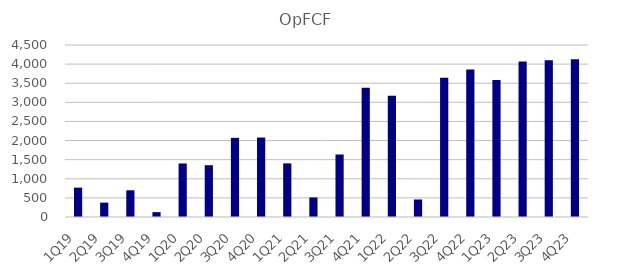
| Category | OpFCF |
|---|---|
| 1Q19 | 768 |
| 2Q19 | 376 |
| 3Q19 | 699 |
| 4Q19 | 127 |
| 1Q20 | 1400 |
| 2Q20 | 1355 |
| 3Q20 | 2071 |
| 4Q20 | 2079 |
| 1Q21 | 1403 |
| 2Q21 | 512 |
| 3Q21 | 1635 |
| 4Q21 | 3381 |
| 1Q22 | 3174 |
| 2Q22 | 457.538 |
| 3Q22 | 3643 |
| 4Q22 | 3858 |
| 1Q23 | 3583 |
| 2Q23 | 4069 |
| 3Q23 | 4103 |
| 4Q23 | 4130 |